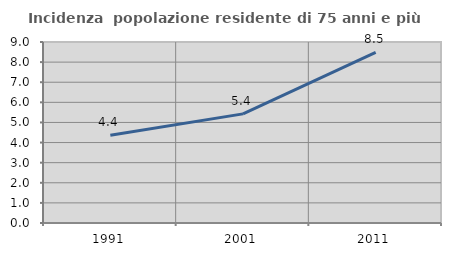
| Category | Incidenza  popolazione residente di 75 anni e più |
|---|---|
| 1991.0 | 4.364 |
| 2001.0 | 5.425 |
| 2011.0 | 8.488 |